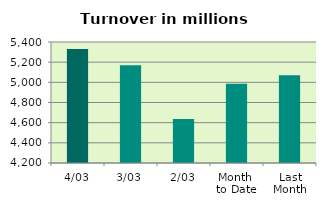
| Category | Series 0 |
|---|---|
| 4/03 | 5329.955 |
| 3/03 | 5169.502 |
| 2/03 | 4636.608 |
| Month 
to Date | 4987.173 |
| Last
Month | 5069.383 |